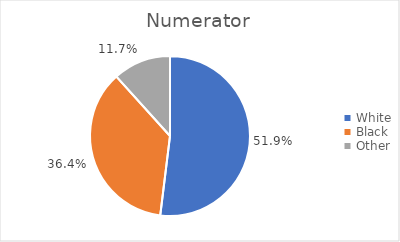
| Category | Numerator |
|---|---|
| White | 40 |
| Black | 28 |
| Other | 9 |